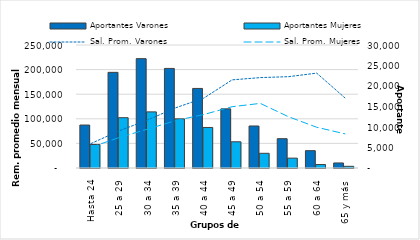
| Category | Aportantes Varones | Aportantes Mujeres |
|---|---|---|
| Hasta 24 | 10480 | 5736 |
| 25 a 29 | 23328 | 12269 |
| 30 a 34 | 26676 | 13689 |
| 35 a 39 | 24286 | 11982 |
| 40 a 44 | 19404 | 9884 |
| 45 a 49 | 14432 | 6392 |
| 50 a 54 | 10244 | 3586 |
| 55 a 59 | 7148 | 2408 |
| 60 a 64 | 4227 | 849 |
| 65 y más | 1228 | 410 |